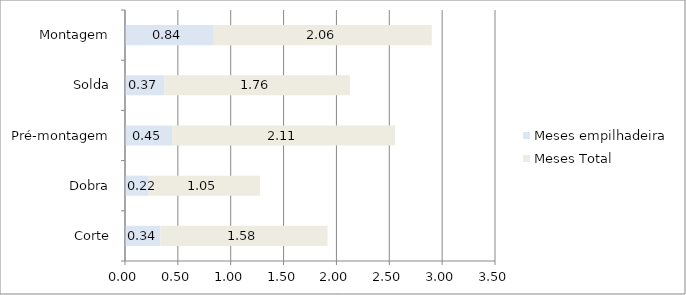
| Category | Meses empilhadeira | Meses Total |
|---|---|---|
| Corte | 0.336 | 1.58 |
| Dobra | 0.224 | 1.053 |
| Pré-montagem | 0.448 | 2.106 |
| Solda | 0.373 | 1.755 |
| Montagem | 0.84 | 2.062 |